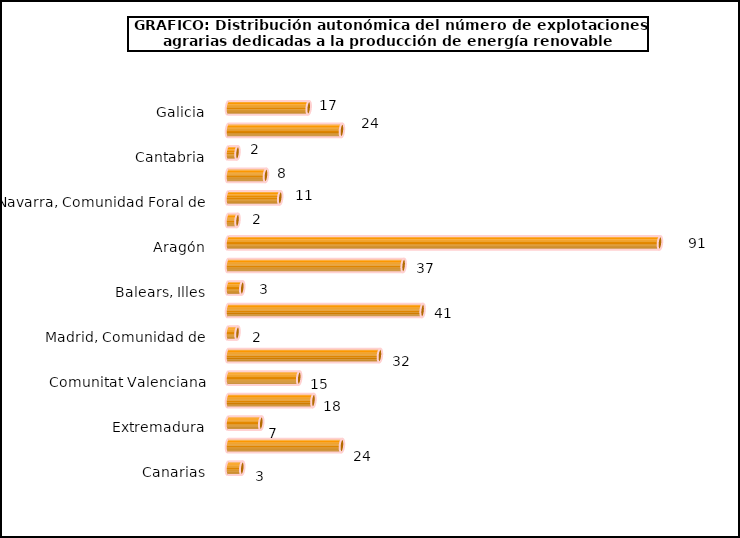
| Category | num. Explotaciones |
|---|---|
| Galicia | 17 |
| Asturias, Principado de | 24 |
| Cantabria | 2 |
| País Vasco | 8 |
| Navarra, Comunidad Foral de | 11 |
| Rioja, La | 2 |
| Aragón | 91 |
| Cataluña | 37 |
| Balears, Illes | 3 |
| Castilla y León | 41 |
| Madrid, Comunidad de | 2 |
| Castilla - La Mancha | 32 |
| Comunitat Valenciana | 15 |
| Murcia, Región de | 18 |
| Extremadura | 7 |
| Andalucía | 24 |
| Canarias | 3 |